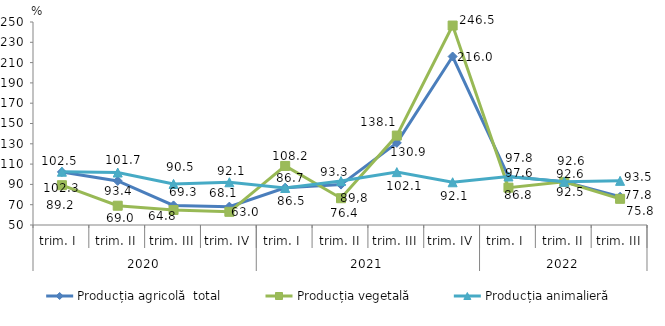
| Category | Producția agricolă  total | Producția vegetală | Producția animalieră |
|---|---|---|---|
| 0 | 102.3 | 89.2 | 102.5 |
| 1 | 93.4 | 69 | 101.7 |
| 2 | 69.3 | 64.8 | 90.5 |
| 3 | 68.1 | 63 | 92.1 |
| 4 | 86.7 | 108.2 | 86.5 |
| 5 | 89.8 | 76.4 | 93.3 |
| 6 | 130.9 | 138.1 | 102.1 |
| 7 | 216 | 246.5 | 92.1 |
| 8 | 97.6 | 86.8 | 97.8 |
| 9 | 92.6 | 92.5 | 92.6 |
| 10 | 77.8 | 75.8 | 93.5 |